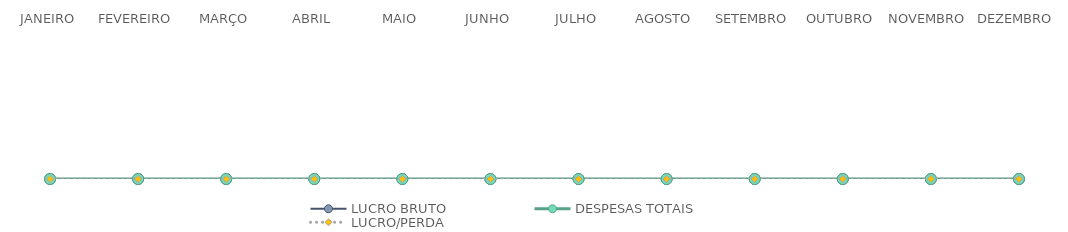
| Category | LUCRO BRUTO | DESPESAS TOTAIS | LUCRO/PERDA |
|---|---|---|---|
| JANEIRO | 0 | 0 | 0 |
| FEVEREIRO | 0 | 0 | 0 |
| MARÇO | 0 | 0 | 0 |
| ABRIL | 0 | 0 | 0 |
| MAIO | 0 | 0 | 0 |
| JUNHO | 0 | 0 | 0 |
| JULHO | 0 | 0 | 0 |
| AGOSTO | 0 | 0 | 0 |
| SETEMBRO | 0 | 0 | 0 |
| OUTUBRO | 0 | 0 | 0 |
| NOVEMBRO | 0 | 0 | 0 |
| DEZEMBRO | 0 | 0 | 0 |